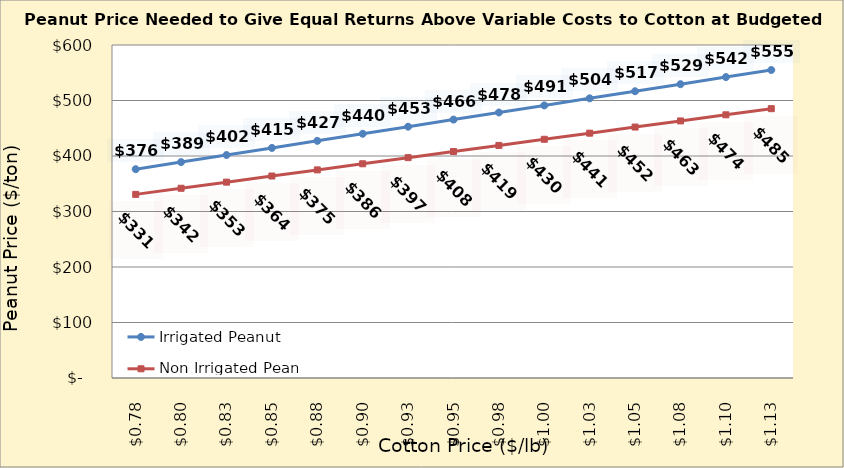
| Category | Irrigated Peanut | Non Irrigated Peanut |
|---|---|---|
| 0.7749999999999998 | 376.237 | 330.842 |
| 0.7999999999999998 | 389.003 | 341.872 |
| 0.8249999999999998 | 401.769 | 352.901 |
| 0.8499999999999999 | 414.535 | 363.93 |
| 0.8749999999999999 | 427.301 | 374.96 |
| 0.8999999999999999 | 440.067 | 385.989 |
| 0.9249999999999999 | 452.833 | 397.019 |
| 0.95 | 465.599 | 408.048 |
| 0.975 | 478.365 | 419.078 |
| 1.0 | 491.131 | 430.107 |
| 1.025 | 503.897 | 441.136 |
| 1.0499999999999998 | 516.663 | 452.166 |
| 1.0749999999999997 | 529.429 | 463.195 |
| 1.0999999999999996 | 542.195 | 474.225 |
| 1.1249999999999996 | 554.961 | 485.254 |